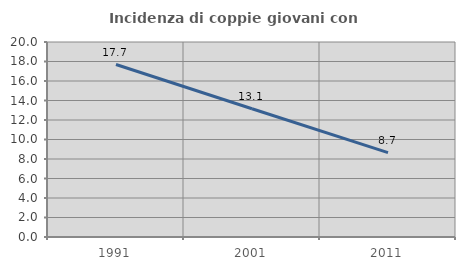
| Category | Incidenza di coppie giovani con figli |
|---|---|
| 1991.0 | 17.689 |
| 2001.0 | 13.15 |
| 2011.0 | 8.655 |